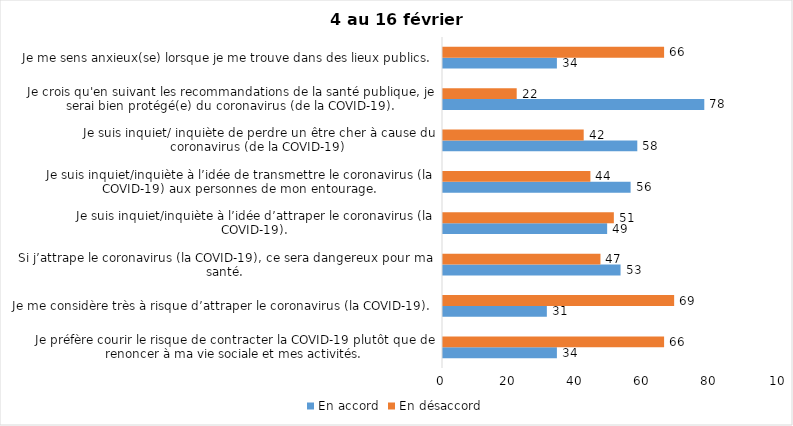
| Category | En accord | En désaccord |
|---|---|---|
| Je préfère courir le risque de contracter la COVID-19 plutôt que de renoncer à ma vie sociale et mes activités. | 34 | 66 |
| Je me considère très à risque d’attraper le coronavirus (la COVID-19). | 31 | 69 |
| Si j’attrape le coronavirus (la COVID-19), ce sera dangereux pour ma santé. | 53 | 47 |
| Je suis inquiet/inquiète à l’idée d’attraper le coronavirus (la COVID-19). | 49 | 51 |
| Je suis inquiet/inquiète à l’idée de transmettre le coronavirus (la COVID-19) aux personnes de mon entourage. | 56 | 44 |
| Je suis inquiet/ inquiète de perdre un être cher à cause du coronavirus (de la COVID-19) | 58 | 42 |
| Je crois qu'en suivant les recommandations de la santé publique, je serai bien protégé(e) du coronavirus (de la COVID-19). | 78 | 22 |
| Je me sens anxieux(se) lorsque je me trouve dans des lieux publics. | 34 | 66 |